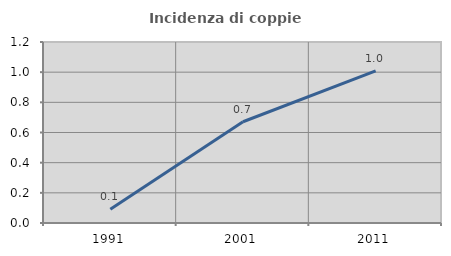
| Category | Incidenza di coppie miste |
|---|---|
| 1991.0 | 0.092 |
| 2001.0 | 0.671 |
| 2011.0 | 1.009 |